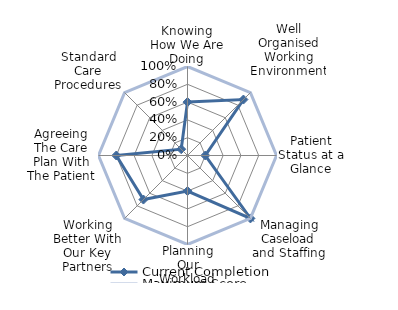
| Category | Current Completion | Maximum Score |
|---|---|---|
| Knowing How We Are Doing | 0.6 | 1 |
| Well Organised Working Environment | 0.889 | 1 |
| Patient Status at a Glance | 0.2 | 1 |
| Managing Caseload and Staffing | 1 | 1 |
| Planning Our Workload | 0.4 | 1 |
| Working Better With Our Key Partners | 0.7 | 1 |
| Agreeing The Care Plan With The Patient | 0.8 | 1 |
| Standard Care Procedures | 0.1 | 1 |